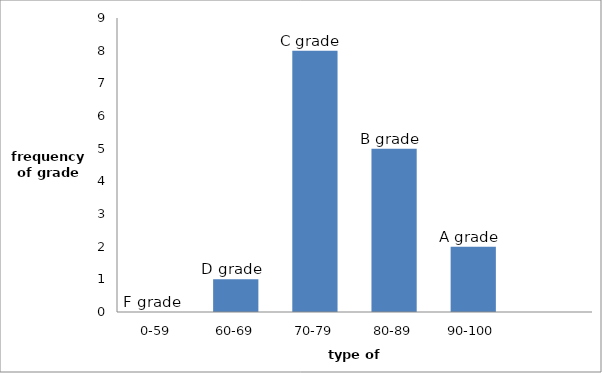
| Category | Frequency |
|---|---|
| 0-59 | 0 |
| 60-69 | 1 |
| 70-79 | 8 |
| 80-89 | 5 |
| 90-100 | 2 |